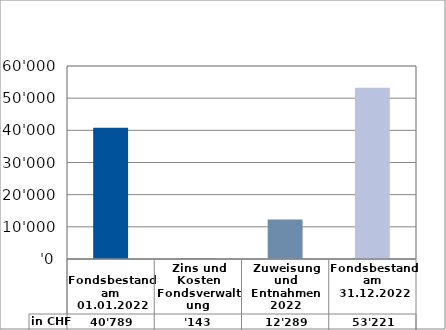
| Category | in CHF |
|---|---|
| 
Fondsbestand am 01.01.2022

 | 40789 |
| Zins und Kosten Fondsverwaltung | 142.75 |
| Zuweisung und Entnahmen 2022 | 12288.9 |
| Fondsbestand am 31.12.2022 | 53220.65 |